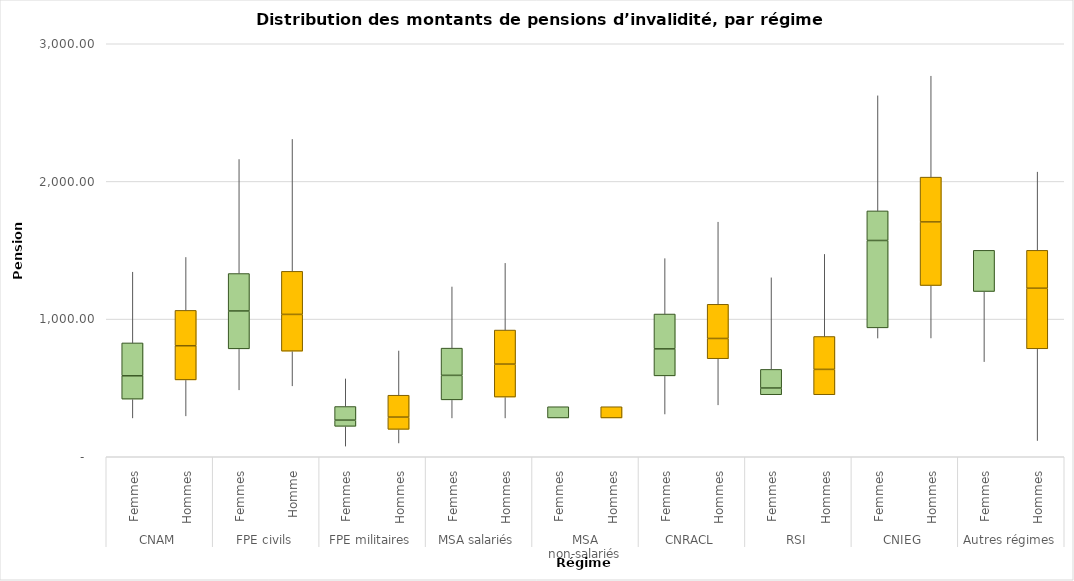
| Category | Series 0 | Series 1 | Series 2 | Series 3 | Series 4 |
|---|---|---|---|---|---|
| 0 | 281.94 | 136.73 | 169.47 | 238.73 | 517.3 |
| 1 | 296.8 | 261.56 | 247.96 | 256.98 | 388.13 |
| 2 | 486 | 298 | 275 | 272 | 832 |
| 3 | 515 | 252 | 267 | 313 | 962 |
| 4 | 77 | 144 | 45 | 99 | 204 |
| 5 | 100 | 99 | 89 | 159 | 325 |
| 6 | 281.94 | 131.44 | 177.94 | 197.8 | 447.8 |
| 7 | 281.94 | 151.73 | 239.33 | 247.38 | 488.22 |
| 8 | 281.94 | 0 | 81.45 | 0 | 0 |
| 9 | 281.94 | 0 | 81.45 | 0 | 0 |
| 10 | 310.43 | 277.18 | 196.1 | 253.13 | 405.97 |
| 11 | 376.96 | 335.06 | 147.17 | 248.44 | 599.89 |
| 12 | 450.45 | 0 | 48.95 | 135.23 | 668.81 |
| 13 | 450.45 | 0 | 184.18 | 239.02 | 599.93 |
| 14 | 861.94 | 74.3 | 634.71 | 214.88 | 839.71 |
| 15 | 862.62 | 381.15 | 462.1 | 325.39 | 736.71 |
| 16 | 690.88 | 509.41 | 299.16 | 0 | 0.91 |
| 17 | 117.65 | 666.61 | 439.87 | 275.32 | 571.61 |